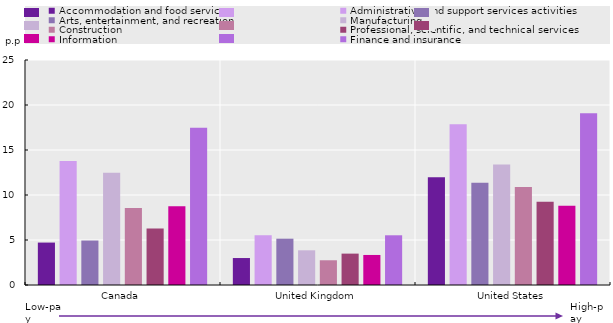
| Category | Accommodation and food services | Administrative and support services activities | Arts, entertainment, and recreation | Manufacturing | Construction | Professional, scientific, and technical services | Information | Finance and insurance |
|---|---|---|---|---|---|---|---|---|
| Canada | 4.714 | 13.773 | 4.942 | 12.477 | 8.551 | 6.28 | 8.737 | 17.483 |
| United Kingdom | 2.996 | 5.529 | 5.146 | 3.854 | 2.748 | 3.487 | 3.338 | 5.523 |
| United States | 11.982 | 17.866 | 11.37 | 13.388 | 10.877 | 9.242 | 8.812 | 19.073 |